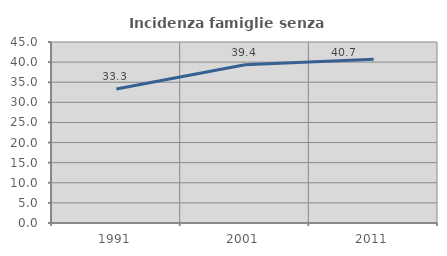
| Category | Incidenza famiglie senza nuclei |
|---|---|
| 1991.0 | 33.333 |
| 2001.0 | 39.352 |
| 2011.0 | 40.741 |